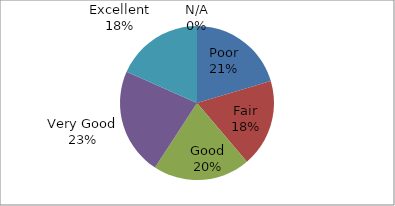
| Category | Series 0 |
|---|---|
| Poor | 10 |
| Fair | 9 |
| Good | 10 |
| Very Good | 11 |
| Excellent | 9 |
| N/A | 0 |